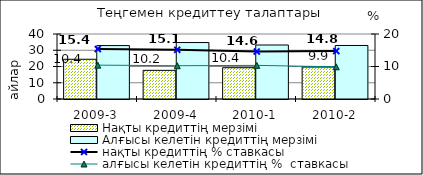
| Category | Нақты кредиттің мерзімі  | Алғысы келетін кредиттің мерзімі  |
|---|---|---|
| 2009-3 | 24.46 | 32.88 |
| 2009-4 | 17.63 | 34.75 |
| 2010-1 | 19.26 | 33.23 |
| 2010-2 | 19.64 | 32.94 |